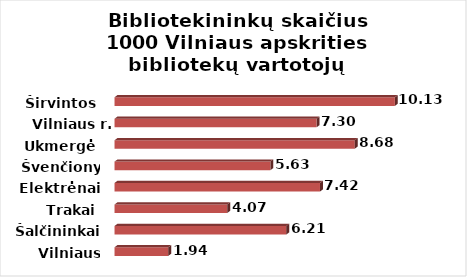
| Category | Series 0 |
|---|---|
| Vilniaus m. | 1.943 |
| Šalčininkai | 6.206 |
| Trakai | 4.069 |
| Elektrėnai | 7.42 |
| Švenčionys | 5.63 |
| Ukmergė | 8.677 |
| Vilniaus r. | 7.299 |
| Širvintos | 10.126 |